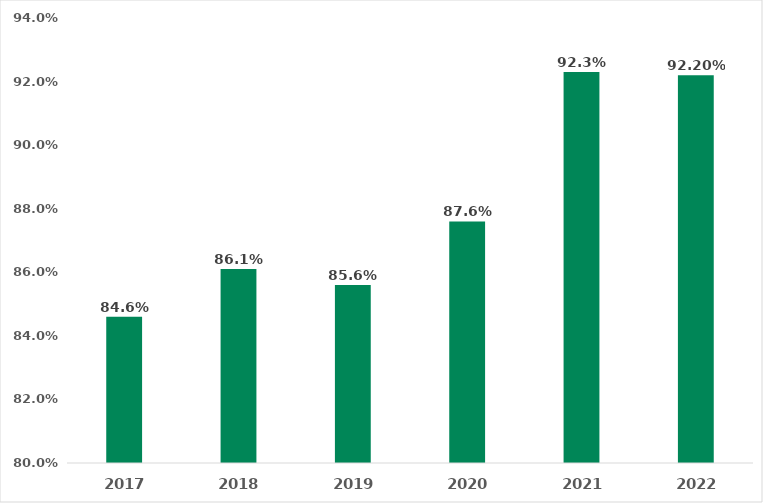
| Category | Disposed%of Patients,% |
|---|---|
| 2017.0 | 0.846 |
| 2018.0 | 0.861 |
| 2019.0 | 0.856 |
| 2020.0 | 0.876 |
| 2021.0 | 0.923 |
| 2022.0 | 0.922 |